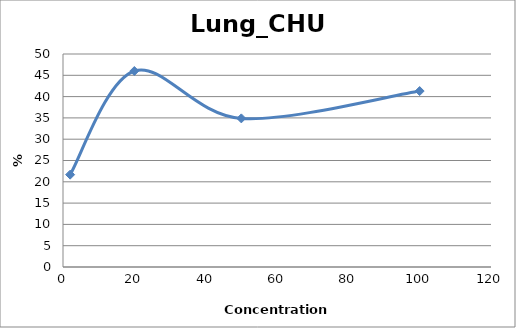
| Category | Lung_CHU2 |
|---|---|
| 100.0 | 41.303 |
| 50.0 | 34.887 |
| 20.0 | 46.005 |
| 2.0 | 21.678 |
| nan | 0 |
| nan | 0 |
| nan | 0 |
| nan | 0 |
| nan | 0 |